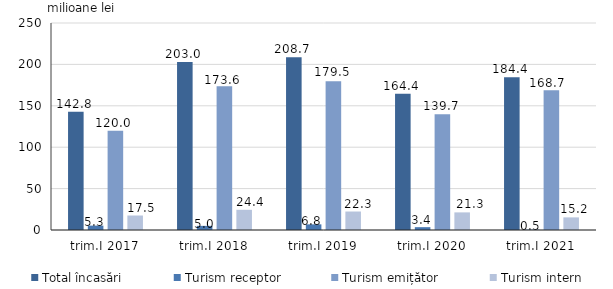
| Category | Total încasări | Turism receptor | Turism emițător | Turism intern |
|---|---|---|---|---|
| trim.I 2017 | 142.8 | 5.3 | 120 | 17.5 |
| trim.I 2018 | 203 | 5 | 173.6 | 24.4 |
| trim.I 2019 | 208.66 | 6.82 | 179.514 | 22.325 |
| trim.I 2020 | 164.403 | 3.433 | 139.703 | 21.267 |
| trim.I 2021 | 184.382 | 0.486 | 168.658 | 15.238 |